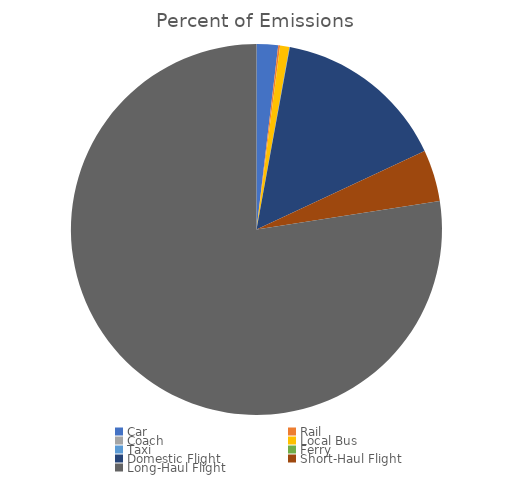
| Category | Percent of Emissions |
|---|---|
| Car | 0.019 |
| Rail | 0.002 |
| Coach | 0 |
| Local Bus | 0.008 |
| Taxi | 0 |
| Ferry | 0 |
| Domestic Flight | 0.152 |
| Short-Haul Flight | 0.045 |
| Long-Haul Flight | 0.775 |